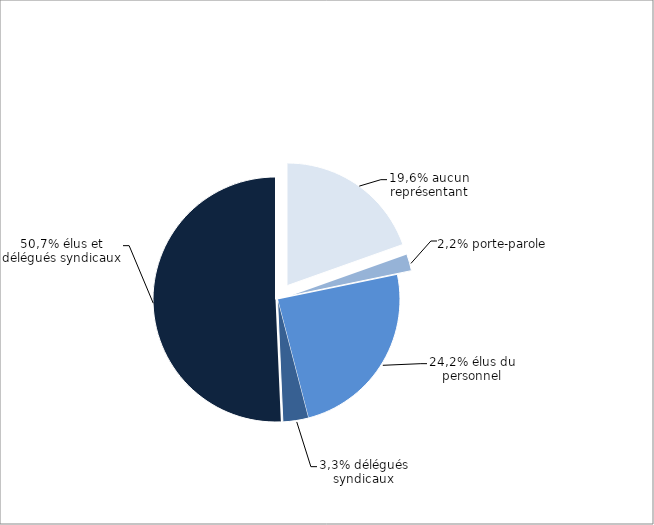
| Category | Series 0 |
|---|---|
| Aucun | 19.57 |
| Porte-parole | 2.18 |
| Elu(s) | 24.21 |
| DS | 3.35 |
| DS+Elu(s) | 50.71 |